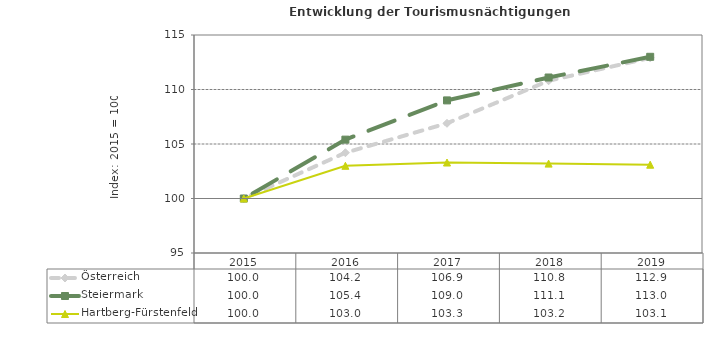
| Category | Österreich | Steiermark | Hartberg-Fürstenfeld |
|---|---|---|---|
| 2019.0 | 112.9 | 113 | 103.1 |
| 2018.0 | 110.8 | 111.1 | 103.2 |
| 2017.0 | 106.9 | 109 | 103.3 |
| 2016.0 | 104.2 | 105.4 | 103 |
| 2015.0 | 100 | 100 | 100 |